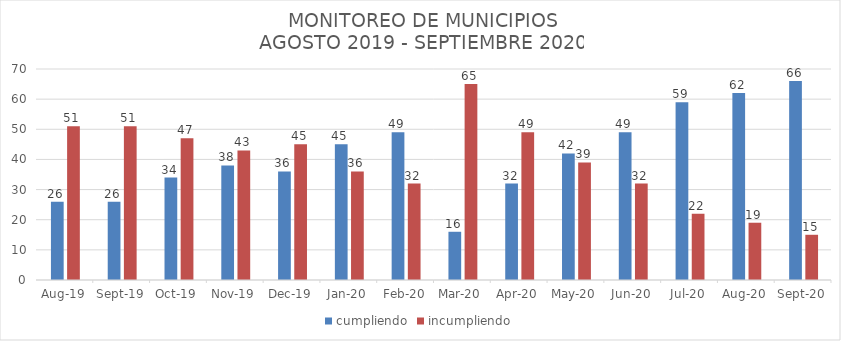
| Category | cumpliendo | incumpliendo |
|---|---|---|
| 2019-08-01 | 26 | 51 |
| 2019-09-01 | 26 | 51 |
| 2019-10-01 | 34 | 47 |
| 2019-11-01 | 38 | 43 |
| 2019-12-01 | 36 | 45 |
| 2020-01-01 | 45 | 36 |
| 2020-02-01 | 49 | 32 |
| 2020-03-01 | 16 | 65 |
| 2020-04-01 | 32 | 49 |
| 2020-05-01 | 42 | 39 |
| 2020-06-01 | 49 | 32 |
| 2020-07-01 | 59 | 22 |
| 2020-08-01 | 62 | 19 |
| 2020-09-01 | 66 | 15 |